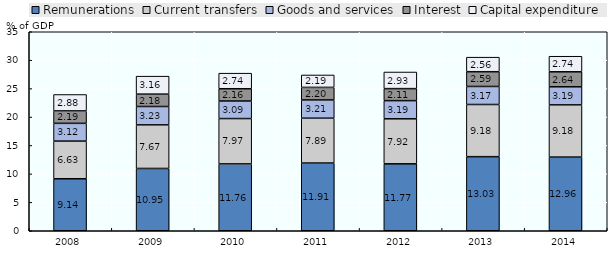
| Category | Remunerations | Current transfers | Goods and services | Interest | Capital expenditure |
|---|---|---|---|---|---|
| 2008.0 | 9.144 | 6.625 | 3.123 | 2.189 | 2.884 |
| 2009.0 | 10.954 | 7.666 | 3.235 | 2.177 | 3.16 |
| 2010.0 | 11.758 | 7.975 | 3.086 | 2.158 | 2.739 |
| 2011.0 | 11.913 | 7.886 | 3.21 | 2.203 | 2.188 |
| 2012.0 | 11.773 | 7.918 | 3.194 | 2.113 | 2.926 |
| 2013.0 | 13.031 | 9.176 | 3.171 | 2.595 | 2.557 |
| 2014.0 | 12.956 | 9.18 | 3.185 | 2.637 | 2.738 |